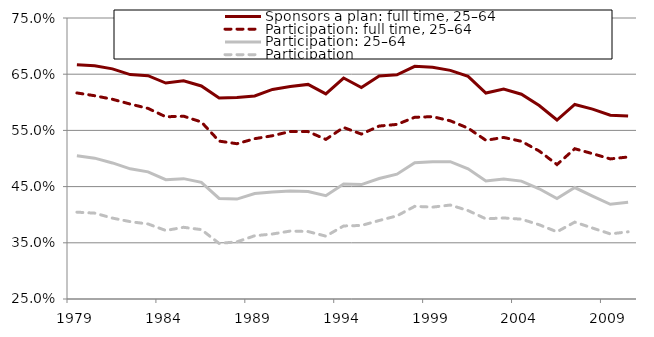
| Category | Sponsors a plan: full time, 25–64 | Participation: full time, 25–64 | Participation: 25–64 | Participation |
|---|---|---|---|---|
| 1979.0 | 0.667 | 0.617 | 0.505 | 0.405 |
| 1980.0 | 0.665 | 0.612 | 0.501 | 0.403 |
| 1981.0 | 0.659 | 0.605 | 0.492 | 0.394 |
| 1982.0 | 0.649 | 0.597 | 0.482 | 0.388 |
| 1983.0 | 0.647 | 0.589 | 0.476 | 0.384 |
| 1984.0 | 0.634 | 0.574 | 0.462 | 0.372 |
| 1985.0 | 0.638 | 0.575 | 0.464 | 0.378 |
| 1986.0 | 0.629 | 0.565 | 0.458 | 0.373 |
| 1987.0 | 0.608 | 0.531 | 0.429 | 0.349 |
| 1988.0 | 0.609 | 0.526 | 0.428 | 0.352 |
| 1989.0 | 0.611 | 0.535 | 0.438 | 0.363 |
| 1990.0 | 0.623 | 0.541 | 0.44 | 0.366 |
| 1991.0 | 0.628 | 0.548 | 0.442 | 0.371 |
| 1992.0 | 0.632 | 0.548 | 0.441 | 0.37 |
| 1993.0 | 0.615 | 0.534 | 0.434 | 0.362 |
| 1994.0 | 0.643 | 0.555 | 0.455 | 0.38 |
| 1995.0 | 0.626 | 0.543 | 0.454 | 0.381 |
| 1996.0 | 0.647 | 0.558 | 0.464 | 0.39 |
| 1997.0 | 0.649 | 0.561 | 0.472 | 0.398 |
| 1998.0 | 0.664 | 0.573 | 0.492 | 0.415 |
| 1999.0 | 0.662 | 0.574 | 0.494 | 0.413 |
| 2000.0 | 0.657 | 0.567 | 0.494 | 0.417 |
| 2001.0 | 0.646 | 0.554 | 0.482 | 0.407 |
| 2002.0 | 0.617 | 0.532 | 0.46 | 0.393 |
| 2003.0 | 0.624 | 0.537 | 0.463 | 0.394 |
| 2004.0 | 0.614 | 0.531 | 0.46 | 0.392 |
| 2005.0 | 0.594 | 0.513 | 0.446 | 0.382 |
| 2006.0 | 0.568 | 0.489 | 0.429 | 0.37 |
| 2007.0 | 0.596 | 0.517 | 0.448 | 0.387 |
| 2008.0 | 0.588 | 0.509 | 0.433 | 0.376 |
| 2009.0 | 0.577 | 0.499 | 0.419 | 0.366 |
| 2010.0 | 0.576 | 0.503 | 0.422 | 0.37 |